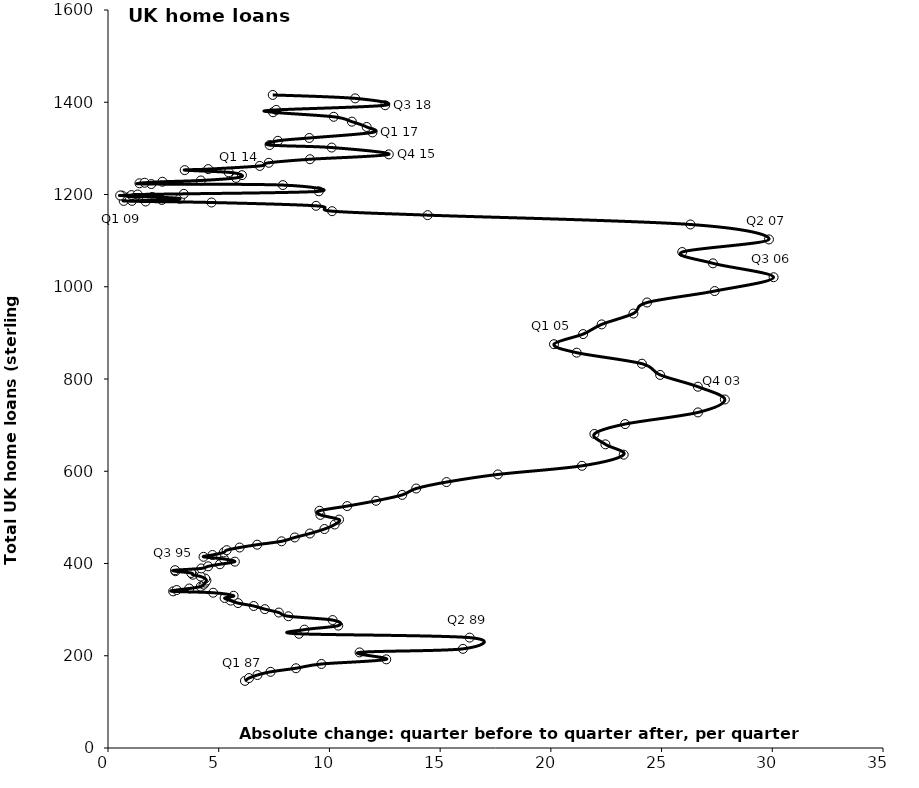
| Category | Series 0 |
|---|---|
| 6.1839999999999975 | 145.476 |
| 6.369 | 151.66 |
| 6.748999999999995 | 158.214 |
| 7.341999999999999 | 165.158 |
| 8.489500000000007 | 172.898 |
| 9.64 | 182.137 |
| 12.5655 | 192.178 |
| 11.361000000000004 | 207.268 |
| 16.028499999999994 | 214.9 |
| 16.3335 | 239.325 |
| 8.623500000000007 | 247.567 |
| 8.87299999999999 | 256.572 |
| 10.399000000000001 | 265.313 |
| 10.144000000000005 | 277.37 |
| 8.147500000000008 | 285.601 |
| 7.715000000000003 | 293.665 |
| 7.082999999999998 | 301.031 |
| 6.579499999999996 | 307.831 |
| 5.873499999999979 | 314.19 |
| 5.538999999999987 | 319.578 |
| 5.2660000000000196 | 325.268 |
| 5.6720000000000255 | 330.11 |
| 4.749499999999983 | 336.612 |
| 2.941999999999979 | 339.609 |
| 3.1025000000000205 | 342.496 |
| 3.6694999999999993 | 345.814 |
| 4.185999999999979 | 349.835 |
| 4.317000000000007 | 354.186 |
| 4.386500000000012 | 358.469 |
| 4.4465000000000146 | 362.959 |
| 4.389999999999986 | 367.362 |
| 4.186999999999983 | 371.739 |
| 3.827500000000015 | 375.736 |
| 3.758499999999998 | 379.394 |
| 3.0430000000000064 | 383.253 |
| 3.02800000000002 | 385.48 |
| 4.216499999999996 | 389.309 |
| 4.522999999999996 | 393.913 |
| 5.0519999999999925 | 398.355 |
| 5.728999999999985 | 404.017 |
| 5.2394999999999925 | 409.813 |
| 4.313999999999993 | 414.496 |
| 4.717500000000001 | 418.441 |
| 5.226500000000016 | 423.931 |
| 5.360000000000014 | 428.894 |
| 5.944500000000005 | 434.651 |
| 6.735500000000002 | 440.783 |
| 7.837999999999994 | 448.122 |
| 8.43549999999999 | 456.459 |
| 9.119499999999988 | 464.993 |
| 9.773500000000013 | 474.698 |
| 10.237500000000011 | 484.54 |
| 10.434499999999986 | 495.173 |
| 9.591499999999996 | 505.409 |
| 9.54849999999999 | 514.356 |
| 10.802999999999997 | 524.506 |
| 12.10650000000004 | 535.962 |
| 13.287500000000023 | 548.719 |
| 13.916499999999985 | 562.537 |
| 15.286999999999978 | 576.552 |
| 17.60949999999997 | 593.111 |
| 21.402500000000032 | 611.771 |
| 23.289500000000032 | 635.916 |
| 22.463499999999954 | 658.35 |
| 21.966000000000008 | 680.843 |
| 23.353499999999997 | 702.282 |
| 26.644000000000005 | 727.55 |
| 27.858000000000004 | 755.57 |
| 26.640499999999975 | 783.266 |
| 24.934500000000014 | 808.851 |
| 24.113 | 833.135 |
| 21.167500000000018 | 857.077 |
| 20.141500000000008 | 875.47 |
| 21.457499999999982 | 897.36 |
| 22.295000000000016 | 918.385 |
| 23.728499999999997 | 941.95 |
| 24.344499999999982 | 965.842 |
| 27.398500000000013 | 990.639 |
| 30.059500000000014 | 1020.639 |
| 27.319999999999993 | 1050.758 |
| 25.932000000000016 | 1075.279 |
| 29.850000000000023 | 1102.622 |
| 26.30250000000001 | 1134.979 |
| 14.435499999999934 | 1155.227 |
| 10.120499999999993 | 1163.85 |
| 9.398500000000013 | 1175.468 |
| 4.675499999999943 | 1182.647 |
| 1.7005000000000337 | 1184.819 |
| 0.70799999999997 | 1186.048 |
| 1.0815000000000055 | 1186.235 |
| 2.4320000000000164 | 1188.211 |
| 3.249500000000012 | 1191.099 |
| 1.9965000000000828 | 1194.71 |
| 0.9505000000000337 | 1195.092 |
| 1.2574999999999363 | 1196.611 |
| 0.6369999999999436 | 1197.607 |
| 0.54849999999999 | 1197.885 |
| 1.0600000000000591 | 1198.704 |
| 1.3395000000000437 | 1200.005 |
| 3.423000000000002 | 1201.383 |
| 9.519000000000005 | 1206.851 |
| 7.897499999999923 | 1220.421 |
| 1.9539999999999509 | 1222.646 |
| 1.4189999999999827 | 1224.329 |
| 1.6575000000000273 | 1225.484 |
| 2.4560000000000173 | 1227.644 |
| 4.192999999999984 | 1230.396 |
| 5.78449999999998 | 1236.03 |
| 6.04849999999999 | 1241.965 |
| 5.4500000000000455 | 1248.127 |
| 3.4640000000000555 | 1252.865 |
| 4.525999999999954 | 1255.055 |
| 6.853999999999928 | 1261.917 |
| 7.259500000000003 | 1268.763 |
| 9.121500000000083 | 1276.436 |
| 12.680500000000052 | 1287.006 |
| 10.101999999999975 | 1301.797 |
| 7.299499999999966 | 1307.21 |
| 7.671500000000037 | 1316.396 |
| 9.091999999999985 | 1322.553 |
| 11.942999999999984 | 1334.58 |
| 11.682000000000016 | 1346.439 |
| 11.01400000000001 | 1357.944 |
| 10.194000000000074 | 1368.467 |
| 7.454499999999939 | 1378.332 |
| 7.59699999999998 | 1383.376 |
| 12.517000000000053 | 1393.526 |
| 11.16199999999992 | 1408.41 |
| 7.439999999999827 | 1415.85 |